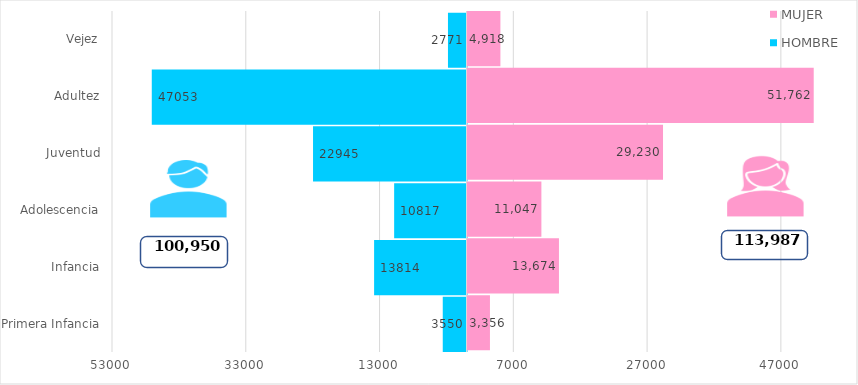
| Category | HOMBRE | MUJER |
|---|---|---|
| Primera Infancia | -3550 | 3356 |
| Infancia | -13814 | 13674 |
| Adolescencia | -10817 | 11047 |
| Juventud | -22945 | 29230 |
| Adultez | -47053 | 51762 |
| Vejez | -2771 | 4918 |